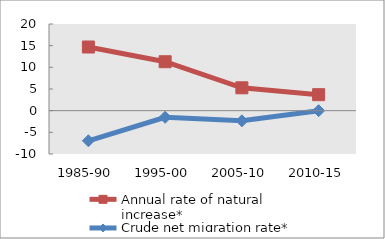
| Category | Annual rate of natural increase* | Crude net migration rate* |
|---|---|---|
| 1985-90 | 14.69 | -6.947 |
| 1995-00 | 11.293 | -1.531 |
| 2005-10 | 5.277 | -2.346 |
| 2010-15 | 3.691 | 0 |